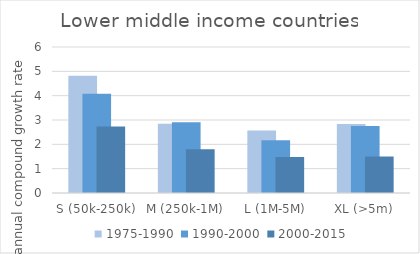
| Category | 1975-1990 | 1990-2000 | 2000-2015 |
|---|---|---|---|
| S (50k-250k) | 4.818 | 4.075 | 2.73 |
| M (250k-1M) | 2.846 | 2.912 | 1.799 |
| L (1M-5M) | 2.571 | 2.165 | 1.476 |
| XL (>5m) | 2.84 | 2.754 | 1.501 |